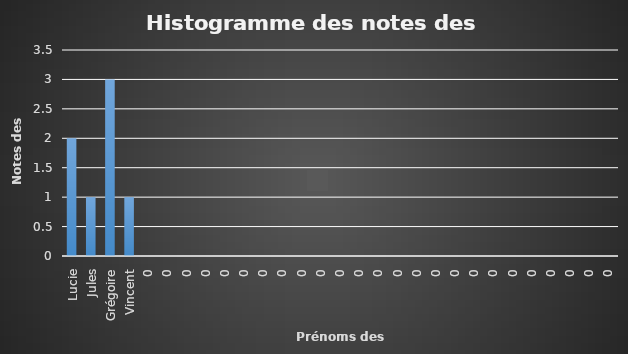
| Category | Series 0 |
|---|---|
| Lucie | 2 |
| Jules | 1 |
| Grégoire | 3 |
| Vincent | 1 |
| 0 | 0 |
| 0 | 0 |
| 0 | 0 |
| 0 | 0 |
| 0 | 0 |
| 0 | 0 |
| 0 | 0 |
| 0 | 0 |
| 0 | 0 |
| 0 | 0 |
| 0 | 0 |
| 0 | 0 |
| 0 | 0 |
| 0 | 0 |
| 0 | 0 |
| 0 | 0 |
| 0 | 0 |
| 0 | 0 |
| 0 | 0 |
| 0 | 0 |
| 0 | 0 |
| 0 | 0 |
| 0 | 0 |
| 0 | 0 |
| 0 | 0 |